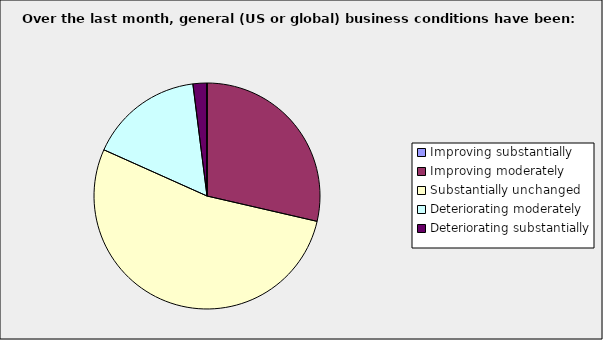
| Category | Series 0 |
|---|---|
| Improving substantially | 0 |
| Improving moderately | 0.286 |
| Substantially unchanged | 0.531 |
| Deteriorating moderately | 0.163 |
| Deteriorating substantially | 0.02 |